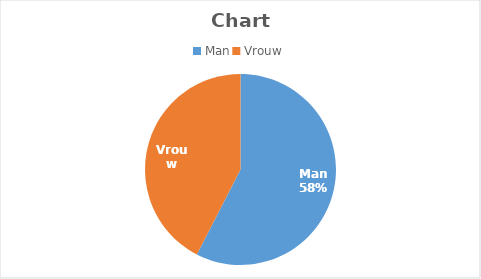
| Category | Series 0 |
|---|---|
| Man | 2186 |
| Vrouw | 1612 |